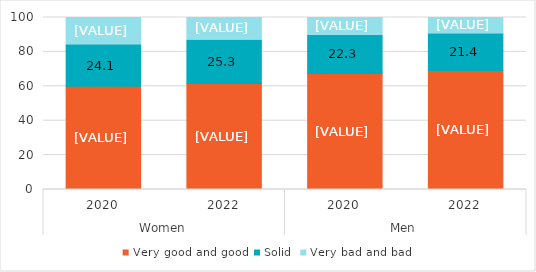
| Category | Very good and good | Solid | Very bad and bad |
|---|---|---|---|
| 0 | 60 | 24.1 | 15.9 |
| 1 | 61.6 | 25.3 | 13.1 |
| 2 | 67.4 | 22.3 | 10.3 |
| 3 | 69.2 | 21.4 | 9.4 |